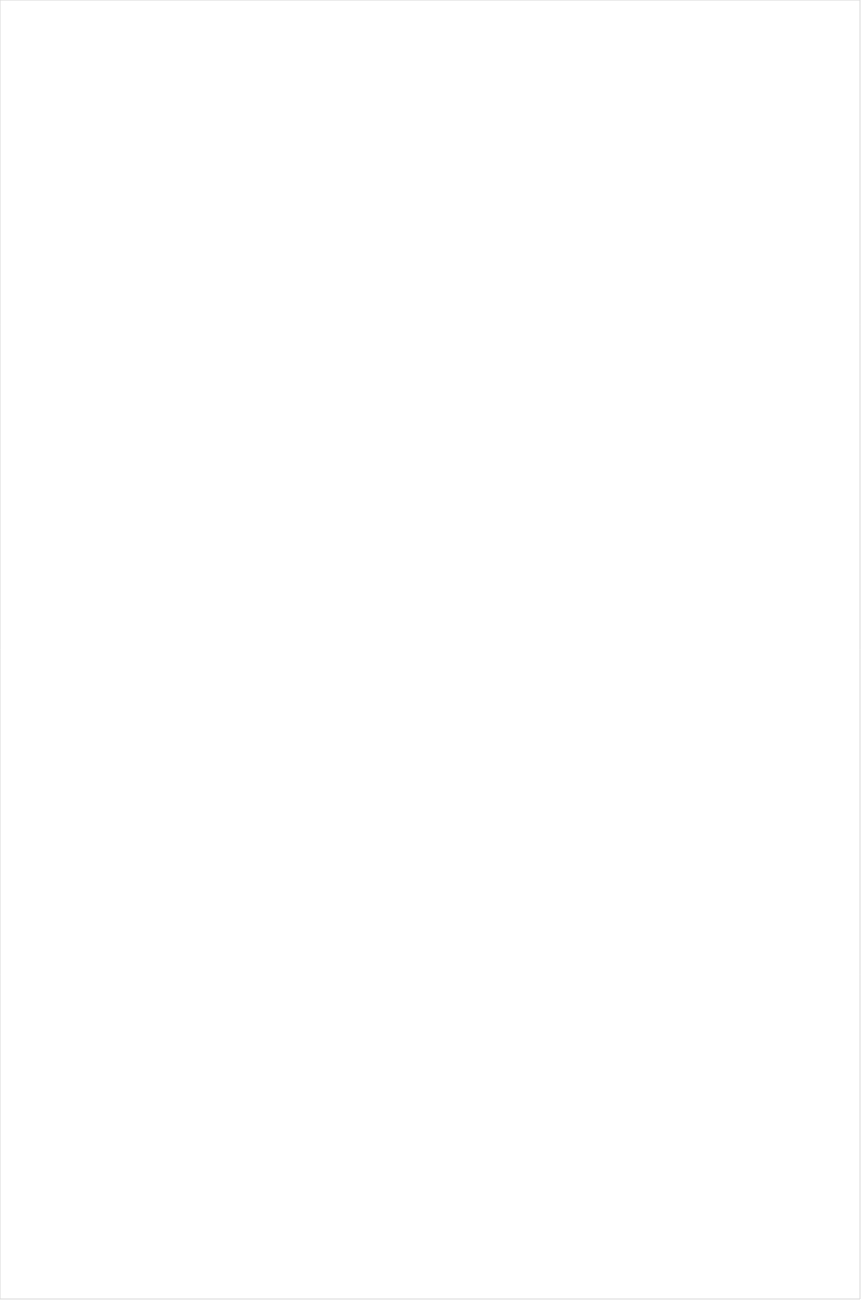
| Category | Total |
|---|---|
| Cartoon Network | -0.686 |
| BET | -0.508 |
| VH1 | -0.493 |
| BET Her | -0.484 |
| Lifetime Movies | -0.473 |
| MyNetworkTV | -0.471 |
| TV ONE | -0.465 |
| Oprah Winfrey Network | -0.418 |
| MTV2 | -0.356 |
| UniMas | -0.322 |
| TLC | -0.299 |
| Disney XD | -0.293 |
| Disney Channel | -0.281 |
| Telemundo | -0.274 |
| Nick Toons | -0.27 |
| Logo | -0.26 |
| UP TV | -0.254 |
| WE TV | -0.251 |
| Univision | -0.221 |
| Adult Swim | -0.221 |
| Universal Kids | -0.219 |
| Travel | -0.217 |
| Nick | -0.212 |
| Discovery Life Channel | -0.204 |
| Hallmark | -0.168 |
| Investigation Discovery | -0.165 |
| Lifetime | -0.16 |
| BRAVO | -0.159 |
| Nick Jr. | -0.157 |
| NBC Universo | -0.156 |
| ION | -0.149 |
| Hallmark Movies & Mysteries | -0.149 |
| Disney Junior US | -0.138 |
| Teen Nick | -0.125 |
| Great American Country | -0.093 |
| CW | -0.092 |
| POP | -0.071 |
| Discovery Family Channel | -0.07 |
| Freeform | -0.068 |
| Galavision | -0.067 |
| OXYGEN | -0.066 |
| E! | -0.057 |
| Headline News | -0.056 |
| CMTV | -0.047 |
| SYFY | -0.02 |
| Nick@Nite | 0.025 |
| PBS | 0.04 |
| TUDN | 0.041 |
| HGTV | 0.044 |
| Discovery Channel | 0.044 |
| MTV | 0.044 |
| A&E | 0.048 |
| Science Channel | 0.051 |
| ABC | 0.051 |
| CBS | 0.058 |
| Motor Trend Network | 0.065 |
| FX | 0.068 |
| INSP | 0.071 |
| NBC | 0.072 |
| Animal Planet | 0.078 |
| Ovation | 0.099 |
| MSNBC | 0.11 |
| FXX | 0.111 |
| FX Movie Channel | 0.134 |
| USA Network | 0.139 |
| History Channel | 0.145 |
| National Geographic Wild | 0.145 |
| FOX | 0.146 |
| TNT | 0.159 |
| WGN America | 0.194 |
| Bloomberg HD | 0.228 |
| Paramount Network | 0.235 |
| CNN | 0.24 |
| Food Network | 0.26 |
| Reelz Channel | 0.26 |
| TBS | 0.26 |
| TV LAND | 0.261 |
| Destination America | 0.265 |
| FYI | 0.291 |
| Fox Business | 0.299 |
| SundanceTV | 0.301 |
| Weather Channel | 0.313 |
| AMC | 0.317 |
| DIY | 0.323 |
| truTV | 0.33 |
| National Geographic | 0.333 |
| Fox News | 0.361 |
| Cooking Channel | 0.387 |
| American Heroes Channel | 0.393 |
| Comedy Central | 0.427 |
| BBC America | 0.438 |
| Viceland | 0.441 |
| Independent Film (IFC) | 0.467 |
| Game Show | 0.468 |
| CNBC | 0.476 |
| Smithsonian | 0.483 |
| RFD TV | 0.493 |
| Outdoor Channel | 0.637 |
| The Sportsman Channel | 0.687 |
| FXDEP | 0.803 |
| Tennis Channel | 0.828 |
| ESPN Deportes | 0.874 |
| Olympic Channel | 0.976 |
| NBC Sports | 1.162 |
| FOX Sports 2 | 1.357 |
| CBS Sports | 1.414 |
| ESPN2 | 1.503 |
| NFL Network | 1.564 |
| ESPN | 1.631 |
| NBA TV | 1.685 |
| ESPNEWS | 1.752 |
| Big Ten Network | 1.864 |
| Fox Sports 1 | 1.94 |
| Golf | 2.111 |
| PAC-12 Network | 2.418 |
| NHL | 2.605 |
| ESPNU | 3.931 |
| MLB Network | 4.701 |